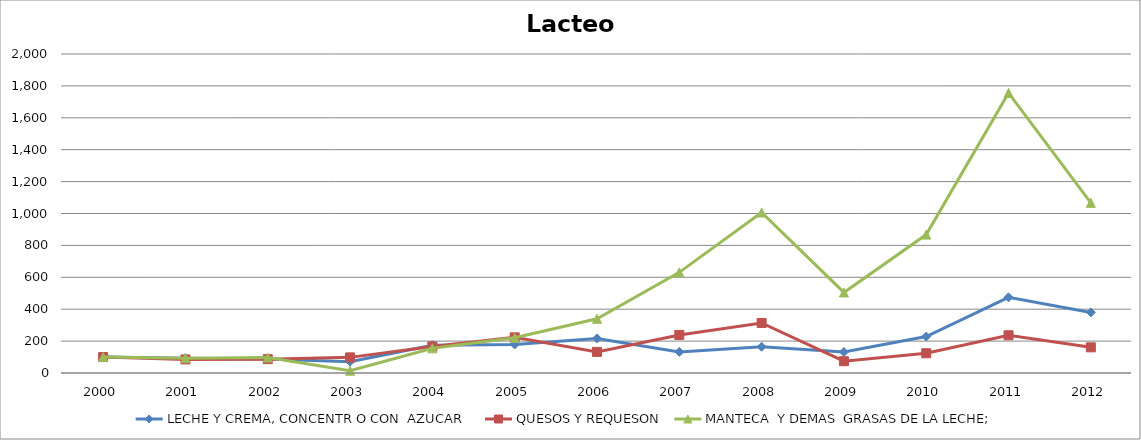
| Category | LECHE Y CREMA, CONCENTR O CON  AZUCAR  | QUESOS Y REQUESON | MANTECA  Y DEMAS  GRASAS DE LA LECHE; |
|---|---|---|---|
| 2000 | 100 | 100 | 100 |
| 2001 | 92.767 | 84.962 | 92.734 |
| 2002 | 87.592 | 86.829 | 96.919 |
| 2003 | 71.149 | 97.995 | 14.257 |
| 2004 | 174.098 | 166.52 | 154.845 |
| 2005 | 178.591 | 223.535 | 220.6 |
| 2006 | 216.841 | 132.501 | 339.89 |
| 2007 | 132.394 | 238.551 | 630.991 |
| 2008 | 164.63 | 313.766 | 1006.084 |
| 2009 | 131.732 | 73.983 | 505.053 |
| 2010 | 228.353 | 123.767 | 867.768 |
| 2011 | 474.443 | 236.498 | 1755.858 |
| 2012 | 379.913 | 160.933 | 1066.709 |